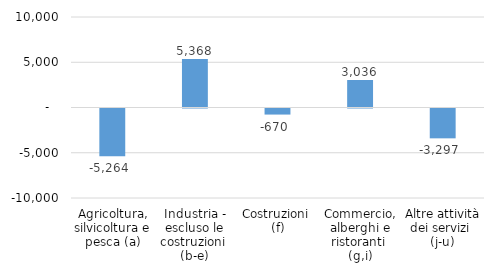
| Category | Series 0 |
|---|---|
| Agricoltura, silvicoltura e pesca (a) | -5264 |
| Industria - escluso le costruzioni 
(b-e) | 5368 |
| Costruzioni 
(f) | -670 |
| Commercio, alberghi e ristoranti 
(g,i) | 3036 |
| Altre attività dei servizi 
(j-u) | -3297 |